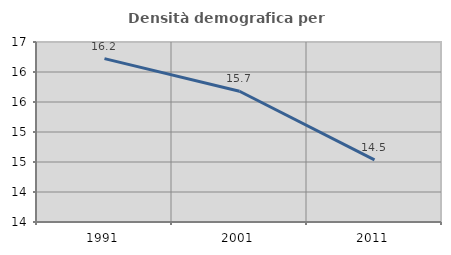
| Category | Densità demografica |
|---|---|
| 1991.0 | 16.223 |
| 2001.0 | 15.679 |
| 2011.0 | 14.536 |